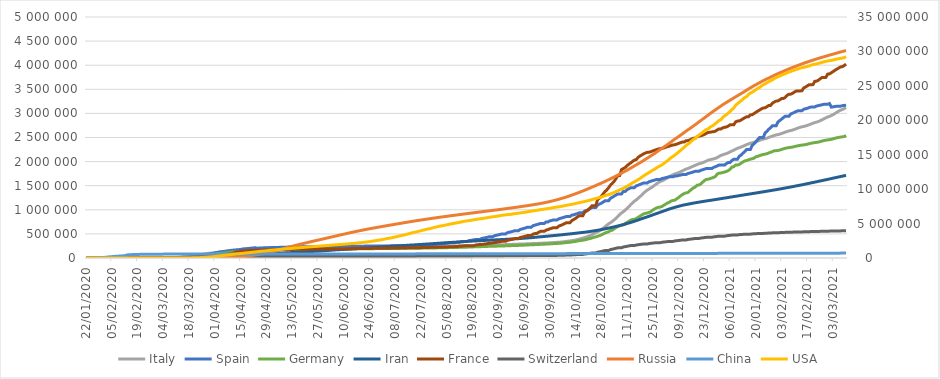
| Category | Italy | Spain | Germany | Iran | France | Switzerland | Russia | China |
|---|---|---|---|---|---|---|---|---|
| 2021-03-10 | 3123368 | 3172101 | 2541781 | 1715162 | 4022429 | 567903 | 4302726 | 101194 |
| 2021-03-09 | 3101093 | 3164982 | 2520618 | 1706559 | 3992755 | 566412 | 4293750 | 101175 |
| 2021-03-08 | 3081368 | 3160970 | 2513784 | 1698005 | 3969612 | 565034 | 4284408 | 101149 |
| 2021-03-07 | 3067486 | 3149012 | 2508655 | 1689692 | 3964078 | 562290 | 4274263 | 101132 |
| 2021-03-06 | 3046762 | 3149012 | 2502151 | 1681682 | 3942243 | 562290 | 4263785 | 101097 |
| 2021-03-05 | 3023129 | 3149012 | 2493887 | 1673470 | 3918937 | 562290 | 4252876 | 101074 |
| 2021-03-04 | 2999119 | 3142358 | 2484306 | 1665103 | 3895430 | 561068 | 4241970 | 101055 |
| 2021-03-03 | 2976274 | 3136321 | 2472913 | 1656699 | 3870144 | 559845 | 4230707 | 101037 |
| 2021-03-02 | 2955434 | 3130184 | 2462061 | 1648174 | 3843241 | 558622 | 4220291 | 101013 |
| 2021-03-01 | 2938371 | 3204531 | 2455569 | 1639679 | 3820369 | 557492 | 4209850 | 100990 |
| 2021-02-28 | 2925265 | 3188553 | 2450295 | 1631169 | 3815639 | 554932 | 4198400 | 100965 |
| 2021-02-27 | 2907825 | 3188553 | 2444177 | 1623159 | 3747263 | 554932 | 4187166 | 100924 |
| 2021-02-26 | 2888923 | 3188553 | 2436506 | 1615184 | 3746707 | 554932 | 4175757 | 100885 |
| 2021-02-25 | 2868435 | 3180212 | 2427069 | 1607081 | 3746475 | 553867 | 4164802 | 100851 |
| 2021-02-24 | 2848564 | 3170644 | 2416037 | 1598875 | 3721061 | 552698 | 4153735 | 100832 |
| 2021-02-23 | 2832162 | 3161432 | 2405263 | 1590605 | 3689534 | 551355 | 4142126 | 100807 |
| 2021-02-22 | 2818863 | 3153971 | 2399499 | 1582275 | 3669354 | 550224 | 4130447 | 100784 |
| 2021-02-21 | 2809246 | 3133122 | 2394515 | 1574012 | 3664700 | 547775 | 4117992 | 100758 |
| 2021-02-20 | 2795796 | 3133122 | 2388421 | 1566081 | 3597113 | 547775 | 4105424 | 100727 |
| 2021-02-19 | 2780882 | 3133122 | 2381259 | 1558159 | 3596167 | 547775 | 4092649 | 100705 |
| 2021-02-18 | 2765412 | 3121687 | 2372209 | 1550142 | 3596156 | 546754 | 4079407 | 100684 |
| 2021-02-17 | 2751657 | 3107172 | 2362364 | 1542076 | 3573638 | 545535 | 4066164 | 100666 |
| 2021-02-16 | 2739591 | 3096343 | 2352766 | 1534034 | 3548452 | 544282 | 4053535 | 100639 |
| 2021-02-15 | 2729223 | 3086286 | 2346876 | 1526023 | 3528856 | 543207 | 4040505 | 100624 |
| 2021-02-14 | 2721879 | 3056035 | 2341744 | 1518263 | 3467884 | 540727 | 4026506 | 100599 |
| 2021-02-13 | 2710819 | 3056035 | 2336906 | 1510873 | 3467051 | 540727 | 4012538 | 100578 |
| 2021-02-12 | 2697296 | 3056035 | 2330414 | 1503753 | 3466623 | 540727 | 3997898 | 100551 |
| 2021-02-11 | 2683403 | 3041454 | 2321225 | 1496455 | 3465964 | 539474 | 3983031 | 100527 |
| 2021-02-10 | 2668266 | 3023601 | 2311297 | 1488981 | 3444888 | 538118 | 3968228 | 100494 |
| 2021-02-09 | 2655319 | 3005487 | 2302051 | 1481396 | 3419210 | 536516 | 3953970 | 100475 |
| 2021-02-08 | 2644707 | 2989085 | 2296323 | 1473756 | 3400324 | 535153 | 3939162 | 100435 |
| 2021-02-07 | 2636738 | 2941990 | 2291673 | 1466435 | 3395981 | 531873 | 3923461 | 100389 |
| 2021-02-06 | 2625098 | 2941990 | 2285003 | 1459370 | 3376266 | 531873 | 3907653 | 100348 |
| 2021-02-05 | 2611659 | 2941990 | 2276027 | 1452380 | 3333773 | 531873 | 3891274 | 100305 |
| 2021-02-04 | 2597446 | 2913425 | 2265536 | 1445326 | 3310071 | 530289 | 3874830 | 100268 |
| 2021-02-03 | 2583790 | 2883465 | 2252504 | 1438286 | 3310051 | 528524 | 3858367 | 100226 |
| 2021-02-02 | 2570608 | 2851869 | 2240017 | 1431416 | 3283645 | 526728 | 3842145 | 100177 |
| 2021-02-01 | 2560957 | 2822805 | 2232327 | 1424596 | 3260308 | 525095 | 3825739 | 100127 |
| 2021-01-31 | 2553032 | 2743119 | 2225659 | 1417999 | 3255920 | 521320 | 3808348 | 100063 |
| 2021-01-30 | 2541783 | 2743119 | 2224911 | 1411731 | 3236685 | 521320 | 3790265 | 99968 |
| 2021-01-29 | 2529070 | 2743119 | 2207278 | 1405414 | 3212613 | 521320 | 3771514 | 99797 |
| 2021-01-28 | 2515507 | 2705001 | 2194562 | 1398841 | 3166145 | 519404 | 3752548 | 99746 |
| 2021-01-27 | 2501147 | 2670102 | 2179679 | 1392314 | 3165449 | 517705 | 3733692 | 99655 |
| 2021-01-26 | 2485956 | 2629817 | 2164043 | 1385706 | 3138498 | 515483 | 3716228 | 99541 |
| 2021-01-25 | 2475372 | 2593382 | 2154656 | 1379286 | 3116355 | 513599 | 3698246 | 99402 |
| 2021-01-24 | 2466813 | 2499560 | 2147769 | 1372977 | 3112055 | 509279 | 3679247 | 99247 |
| 2021-01-23 | 2455185 | 2499560 | 2137691 | 1367032 | 3093619 | 509279 | 3658447 | 99047 |
| 2021-01-22 | 2441854 | 2499560 | 2125154 | 1360852 | 3069663 | 509279 | 3637862 | 98786 |
| 2021-01-21 | 2428221 | 2456675 | 2108895 | 1354520 | 3046371 | 507123 | 3616680 | 98544 |
| 2021-01-20 | 2414166 | 2412318 | 2100618 | 1348316 | 3023661 | 504918 | 3595136 | 98544 |
| 2021-01-19 | 2400598 | 2370742 | 2071615 | 1342134 | 2996784 | 502191 | 3574330 | 98323 |
| 2021-01-18 | 2390102 | 2336451 | 2059382 | 1336217 | 2972889 | 499931 | 3552888 | 98164 |
| 2021-01-17 | 2381277 | 2252164 | 2050129 | 1330411 | 2969091 | 495228 | 3530379 | 97939 |
| 2021-01-16 | 2368733 | 2252164 | 2038645 | 1324395 | 2931686 | 495228 | 3507201 | 97775 |
| 2021-01-15 | 2352423 | 2252164 | 2022884 | 1318295 | 2930994 | 495228 | 3483531 | 97448 |
| 2021-01-14 | 2336279 | 2211967 | 2015235 | 1311810 | 2909723 | 492832 | 3459237 | 97448 |
| 2021-01-13 | 2319036 | 2176089 | 1993892 | 1305339 | 2888292 | 490358 | 3434934 | 97275 |
| 2021-01-12 | 2303263 | 2137220 | 1968326 | 1299022 | 2864360 | 487357 | 3412390 | 97095 |
| 2021-01-11 | 2289021 | 2111782 | 1941116 | 1292614 | 2844680 | 484506 | 3389733 | 96920 |
| 2021-01-10 | 2276491 | 2050360 | 1929410 | 1286406 | 2840864 | 477983 | 3366715 | 96824 |
| 2021-01-09 | 2257866 | 2050360 | 1928462 | 1280438 | 2824920 | 477983 | 3344175 | 96690 |
| 2021-01-08 | 2237890 | 2050360 | 1893901 | 1274514 | 2763563 | 477983 | 3321163 | 96489 |
| 2021-01-07 | 2220361 | 2024904 | 1886561 | 1268263 | 2763370 | 474764 | 3297833 | 96484 |
| 2021-01-06 | 2201945 | 1982544 | 1841228 | 1261903 | 2763116 | 470789 | 3274615 | 96398 |
| 2021-01-05 | 2181619 | 1982544 | 1814565 | 1255620 | 2737884 | 465981 | 3250713 | 96310 |
| 2021-01-04 | 2166244 | 1958844 | 1796216 | 1249507 | 2717059 | 461961 | 3226758 | 96246 |
| 2021-01-03 | 2155446 | 1928265 | 1783896 | 1243434 | 2712975 | 452296 | 3203743 | 96160 |
| 2021-01-02 | 2141201 | 1928265 | 1773540 | 1237474 | 2700480 | 452296 | 3179898 | 96086 |
| 2021-01-01 | 2129376 | 1928265 | 1762244 | 1231429 | 2677871 | 452296 | 3153960 | 96005 |
| 2020-12-31 | 2107166 | 1928265 | 1760520 | 1225142 | 2677666 | 452296 | 3127347 | 95963 |
| 2020-12-30 | 2083689 | 1910218 | 1741153 | 1218753 | 2657624 | 447905 | 3100018 | 95876 |
| 2020-12-29 | 2067487 | 1893502 | 1692109 | 1212481 | 2631110 | 442481 | 3073923 | 95797 |
| 2020-12-28 | 2056277 | 1879413 | 1672643 | 1206373 | 2619616 | 438284 | 3047335 | 95720 |
| 2020-12-27 | 2047696 | 1854951 | 1658639 | 1200465 | 2616510 | 428197 | 3019972 | 95632 |
| 2020-12-26 | 2038759 | 1854951 | 1646240 | 1194963 | 2607688 | 428197 | 2992123 | 95541 |
| 2020-12-25 | 2028354 | 1854951 | 1632512 | 1189203 | 2604595 | 428197 | 2963290 | 95440 |
| 2020-12-24 | 2009317 | 1854951 | 1630596 | 1183182 | 2584333 | 428197 | 2934695 | 95383 |
| 2020-12-23 | 1991278 | 1842289 | 1604129 | 1177004 | 2562615 | 423299 | 2905196 | 95298 |
| 2020-12-22 | 1977370 | 1829903 | 1570371 | 1170743 | 2547577 | 418266 | 2878382 | 95228 |
| 2020-12-21 | 1964054 | 1819249 | 1534218 | 1164535 | 2535716 | 413991 | 2850042 | 95150 |
| 2020-12-20 | 1953185 | 1797236 | 1514962 | 1158384 | 2529756 | 403989 | 2821125 | 95050 |
| 2020-12-19 | 1938083 | 1797236 | 1508518 | 1152072 | 2516957 | 403989 | 2792615 | 94953 |
| 2020-12-18 | 1923158 | 1797236 | 1469667 | 1145651 | 2483661 | 403989 | 2764843 | 94804 |
| 2020-12-17 | 1906377 | 1785421 | 1454009 | 1138530 | 2483524 | 399511 | 2736727 | 94734 |
| 2020-12-16 | 1888144 | 1773290 | 1423830 | 1131077 | 2465126 | 394453 | 2708940 | 94626 |
| 2020-12-15 | 1870576 | 1762212 | 1391086 | 1123474 | 2447406 | 388828 | 2682866 | 94537 |
| 2020-12-14 | 1855737 | 1751884 | 1357261 | 1115770 | 2435751 | 384557 | 2656601 | 94427 |
| 2020-12-13 | 1843712 | 1730575 | 1350810 | 1108269 | 2430612 | 373831 | 2629699 | 94328 |
| 2020-12-12 | 1825775 | 1730575 | 1336101 | 1100818 | 2405255 | 373831 | 2602048 | 94217 |
| 2020-12-11 | 1805873 | 1730575 | 1314309 | 1092407 | 2405210 | 373831 | 2574319 | 94124 |
| 2020-12-10 | 1787147 | 1720056 | 1287092 | 1083023 | 2391643 | 368695 | 2546113 | 94025 |
| 2020-12-09 | 1770149 | 1712101 | 1254358 | 1072620 | 2377913 | 363654 | 2518551 | 93898 |
| 2020-12-08 | 1757394 | 1702328 | 1229269 | 1062397 | 2363196 | 358568 | 2492713 | 93782 |
| 2020-12-07 | 1742557 | 1702328 | 1200006 | 1051374 | 2349059 | 354306 | 2466961 | 93670 |
| 2020-12-06 | 1728878 | 1684647 | 1194550 | 1040547 | 2345648 | 344497 | 2439163 | 93577 |
| 2020-12-05 | 1709991 | 1684647 | 1183640 | 1028986 | 2334626 | 344497 | 2410462 | 93467 |
| 2020-12-04 | 1688939 | 1684647 | 1157514 | 1016835 | 2321703 | 344497 | 2382012 | 93348 |
| 2020-12-03 | 1664829 | 1675902 | 1141544 | 1003494 | 2310271 | 340115 | 2354934 | 93221 |
| 2020-12-02 | 1641610 | 1665775 | 1117953 | 989572 | 2297393 | 335660 | 2327105 | 93113 |
| 2020-12-01 | 1620901 | 1656444 | 1094678 | 975951 | 2283172 | 330874 | 2302062 | 92993 |
| 2020-11-30 | 1601554 | 1648187 | 1069912 | 962070 | 2274902 | 327072 | 2275936 | 92902 |
| 2020-11-29 | 1585178 | 1628208 | 1055691 | 948749 | 2270573 | 318290 | 2249890 | 92814 |
| 2020-11-28 | 1564532 | 1628208 | 1052494 | 935799 | 2260789 | 318290 | 2223500 | 92681 |
| 2020-11-27 | 1538217 | 1628208 | 1038649 | 922397 | 2248209 | 318290 | 2196691 | 92586 |
| 2020-11-26 | 1509875 | 1617355 | 1017830 | 908346 | 2235537 | 313978 | 2169424 | 92488 |
| 2020-11-25 | 1480874 | 1605066 | 995879 | 894385 | 2221874 | 309469 | 2144229 | 92402 |
| 2020-11-24 | 1455022 | 1594844 | 963192 | 880542 | 2206126 | 304593 | 2120836 | 92296 |
| 2020-11-23 | 1431795 | 1582616 | 946822 | 866821 | 2195940 | 300352 | 2096749 | 92211 |
| 2020-11-22 | 1408868 | 1556730 | 932367 | 854361 | 2191180 | 290601 | 2071858 | 92116 |
| 2020-11-21 | 1380531 | 1556730 | 927990 | 841308 | 2178023 | 290601 | 2047563 | 92037 |
| 2020-11-20 | 1345767 | 1556730 | 914118 | 828377 | 2160343 | 290601 | 2023025 | 91977 |
| 2020-11-19 | 1308528 | 1541574 | 891525 | 815117 | 2137096 | 285655 | 1998966 | 91935 |
| 2020-11-18 | 1272352 | 1525341 | 867484 | 801894 | 2115717 | 280648 | 1975629 | 91906 |
| 2020-11-17 | 1238072 | 1510023 | 843757 | 788473 | 2087183 | 274534 | 1954912 | 91885 |
| 2020-11-16 | 1205881 | 1496864 | 817526 | 775121 | 2041293 | 269974 | 1932711 | 91872 |
| 2020-11-15 | 1178529 | 1458591 | 802946 | 762068 | 2031472 | 257135 | 1910149 | 91850 |
| 2020-11-14 | 1144552 | 1458591 | 799733 | 749525 | 2004244 | 257135 | 1887836 | 91828 |
| 2020-11-13 | 1107303 | 1458591 | 785093 | 738322 | 1972149 | 257135 | 1865395 | 91807 |
| 2020-11-12 | 1066401 | 1437220 | 762832 | 726585 | 1948134 | 250396 | 1843678 | 91783 |
| 2020-11-11 | 1028424 | 1417709 | 738094 | 715068 | 1914722 | 243472 | 1822345 | 91752 |
| 2020-11-10 | 995463 | 1381218 | 715693 | 703288 | 1878498 | 235202 | 1802762 | 91719 |
| 2020-11-09 | 960373 | 1381218 | 689146 | 692949 | 1856027 | 229222 | 1781997 | 91693 |
| 2020-11-08 | 935104 | 1328832 | 682624 | 682486 | 1835187 | 211913 | 1760420 | 91665 |
| 2020-11-07 | 902490 | 1328832 | 668114 | 673250 | 1709773 | 211913 | 1740172 | 91622 |
| 2020-11-06 | 862681 | 1328832 | 653992 | 663800 | 1709716 | 211913 | 1720063 | 91591 |
| 2020-11-05 | 824879 | 1306316 | 631172 | 654936 | 1648989 | 202504 | 1699695 | 91552 |
| 2020-11-04 | 790377 | 1284408 | 608611 | 646164 | 1591152 | 192376 | 1680579 | 91509 |
| 2020-11-03 | 759829 | 1259366 | 577131 | 637712 | 1549174 | 182303 | 1661096 | 91478 |
| 2020-11-02 | 731588 | 1240697 | 569598 | 628780 | 1512541 | 176177 | 1642665 | 91452 |
| 2020-11-01 | 709335 | 1185678 | 544346 | 620491 | 1458999 | 154251 | 1624648 | 91397 |
| 2020-10-31 | 679430 | 1185678 | 531790 | 612772 | 1412709 | 154251 | 1606267 | 91366 |
| 2020-10-30 | 647674 | 1185678 | 517736 | 604952 | 1377347 | 154251 | 1588433 | 91339 |
| 2020-10-29 | 616595 | 1160083 | 498354 | 596941 | 1327852 | 145044 | 1570446 | 91299 |
| 2020-10-28 | 589766 | 1136503 | 479621 | 588648 | 1280215 | 135658 | 1553028 | 91271 |
| 2020-10-27 | 564778 | 1116738 | 463419 | 581824 | 1244242 | 127042 | 1537142 | 91222 |
| 2020-10-26 | 542789 | 1098320 | 450258 | 574856 | 1209651 | 121093 | 1520800 | 91175 |
| 2020-10-25 | 525782 | 1046132 | 437698 | 568896 | 1084746 | 103653 | 1503652 | 91151 |
| 2020-10-24 | 504509 | 1046132 | 427808 | 562705 | 1084684 | 103653 | 1487260 | 91128 |
| 2020-10-23 | 484869 | 1046132 | 417350 | 556891 | 1084659 | 103653 | 1471000 | 91108 |
| 2020-10-22 | 465726 | 1026281 | 403874 | 550757 | 1041991 | 97019 | 1453923 | 91073 |
| 2020-10-21 | 449648 | 1005295 | 397922 | 545286 | 1000369 | 91763 | 1438219 | 91044 |
| 2020-10-20 | 434449 | 988322 | 385591 | 539670 | 973275 | 86167 | 1422775 | 91022 |
| 2020-10-19 | 423578 | 974449 | 377068 | 534631 | 952600 | 83159 | 1406667 | 91006 |
| 2020-10-18 | 414241 | 936560 | 368671 | 530380 | 876342 | 74422 | 1390824 | 90972 |
| 2020-10-17 | 402536 | 936560 | 364664 | 526490 | 876342 | 74422 | 1376020 | 90955 |
| 2020-10-16 | 391611 | 936560 | 359802 | 522387 | 876342 | 74422 | 1361317 | 90925 |
| 2020-10-15 | 381602 | 921374 | 352107 | 517835 | 850997 | 71317 | 1346380 | 90905 |
| 2020-10-14 | 372799 | 908056 | 344487 | 513219 | 820376 | 68704 | 1332824 | 90869 |
| 2020-10-13 | 365467 | 896086 | 337314 | 508389 | 798257 | 65881 | 1318783 | 90858 |
| 2020-10-12 | 359569 | 888968 | 332850 | 504281 | 776097 | 64436 | 1305093 | 90830 |
| 2020-10-11 | 354950 | 861112 | 326309 | 500075 | 732434 | 60368 | 1291687 | 90812 |
| 2020-10-10 | 349494 | 861112 | 323463 | 496253 | 732434 | 60368 | 1278245 | 90778 |
| 2020-10-09 | 343770 | 861112 | 320495 | 492378 | 732434 | 60368 | 1265572 | 90751 |
| 2020-10-08 | 338398 | 848324 | 315941 | 488236 | 711704 | 58881 | 1253603 | 90728 |
| 2020-10-07 | 333940 | 835901 | 311137 | 483844 | 693603 | 57709 | 1242258 | 90687 |
| 2020-10-06 | 330263 | 825410 | 307127 | 479825 | 675736 | 56632 | 1231277 | 90667 |
| 2020-10-05 | 327586 | 813412 | 304673 | 475674 | 664289 | 55932 | 1219796 | 90652 |
| 2020-10-04 | 325329 | 789932 | 301573 | 471772 | 629509 | 54384 | 1209039 | 90629 |
| 2020-10-03 | 322751 | 789932 | 300027 | 468119 | 629509 | 54384 | 1198663 | 90604 |
| 2020-10-02 | 319908 | 789932 | 298374 | 464596 | 629431 | 54384 | 1188928 | 90584 |
| 2020-10-01 | 317409 | 778607 | 295539 | 461044 | 616986 | 53832 | 1179634 | 90567 |
| 2020-09-30 | 314861 | 769188 | 292913 | 457219 | 604031 | 53282 | 1170799 | 90545 |
| 2020-09-29 | 313011 | 748266 | 290471 | 453637 | 590021 | 52871 | 1162428 | 90528 |
| 2020-09-28 | 311364 | 748266 | 288631 | 449960 | 577980 | 52646 | 1154299 | 90505 |
| 2020-09-27 | 309870 | 716481 | 286339 | 446448 | 552473 | 51864 | 1146273 | 90483 |
| 2020-09-26 | 308104 | 716481 | 285026 | 443086 | 552454 | 51864 | 1138509 | 90456 |
| 2020-09-25 | 306235 | 716481 | 283712 | 439882 | 552421 | 51864 | 1131088 | 90441 |
| 2020-09-24 | 304323 | 704209 | 281346 | 436319 | 536289 | 51492 | 1123976 | 90424 |
| 2020-09-23 | 302537 | 693556 | 279025 | 432798 | 508456 | 51101 | 1117487 | 90409 |
| 2020-09-22 | 300897 | 682267 | 277412 | 429193 | 507150 | 50664 | 1111157 | 90399 |
| 2020-09-21 | 299506 | 671468 | 275560 | 425481 | 496851 | 50378 | 1105048 | 90381 |
| 2020-09-20 | 298156 | 640040 | 273965 | 422140 | 467614 | 49283 | 1098958 | 90369 |
| 2020-09-19 | 296569 | 640040 | 272932 | 419043 | 467614 | 49283 | 1092915 | 90334 |
| 2020-09-18 | 294932 | 640040 | 271247 | 416198 | 467421 | 49283 | 1086955 | 90311 |
| 2020-09-17 | 293025 | 625651 | 269048 | 413149 | 454266 | 48795 | 1081152 | 90294 |
| 2020-09-16 | 291442 | 614360 | 266869 | 410334 | 443869 | 48265 | 1075485 | 90253 |
| 2020-09-15 | 289990 | 603167 | 265014 | 407353 | 433905 | 47751 | 1069873 | 90235 |
| 2020-09-14 | 288761 | 593730 | 263222 | 404648 | 425870 | 47436 | 1064438 | 90219 |
| 2020-09-13 | 287753 | 566326 | 261737 | 402029 | 402893 | 47179 | 1059024 | 90197 |
| 2020-09-12 | 286297 | 566326 | 260817 | 399940 | 402811 | 46704 | 1053663 | 90168 |
| 2020-09-11 | 284796 | 566326 | 259735 | 397801 | 401890 | 46239 | 1048257 | 90145 |
| 2020-09-10 | 283180 | 554143 | 258149 | 395488 | 392243 | 45711 | 1042836 | 90127 |
| 2020-09-09 | 281583 | 543379 | 256433 | 393425 | 383292 | 45306 | 1037526 | 90100 |
| 2020-09-08 | 280153 | 534513 | 254957 | 391112 | 373718 | 44837 | 1032354 | 90087 |
| 2020-09-07 | 278784 | 525549 | 253626 | 388810 | 367174 | 44592 | 1027334 | 90078 |
| 2020-09-06 | 277634 | 498989 | 251728 | 386658 | 347268 | 44401 | 1022228 | 90058 |
| 2020-09-05 | 276338 | 498989 | 251058 | 384666 | 347267 | 43957 | 1017131 | 90025 |
| 2020-09-04 | 274644 | 498989 | 250283 | 382772 | 347267 | 43532 | 1011987 | 90008 |
| 2020-09-03 | 272912 | 488513 | 248840 | 380746 | 338220 | 43127 | 1006923 | 89986 |
| 2020-09-02 | 271515 | 479554 | 247411 | 378752 | 331060 | 42763 | 1001965 | 89953 |
| 2020-09-01 | 270189 | 470973 | 246015 | 376894 | 323968 | 42393 | 997072 | 89933 |
| 2020-08-31 | 269214 | 462858 | 244802 | 375212 | 318986 | 42177 | 992402 | 89914 |
| 2020-08-30 | 268218 | 439286 | 243305 | 373570 | 315813 | 42014 | 987470 | 89895 |
| 2020-08-29 | 266853 | 439286 | 242835 | 371816 | 304947 | 41722 | 982573 | 89863 |
| 2020-08-28 | 265409 | 439286 | 242126 | 369911 | 304947 | 41346 | 977730 | 89836 |
| 2020-08-27 | 263949 | 429507 | 240571 | 367796 | 297485 | 41006 | 972972 | 89814 |
| 2020-08-26 | 262540 | 419849 | 239010 | 365606 | 291374 | 40645 | 968297 | 89784 |
| 2020-08-25 | 261174 | 412553 | 237583 | 363363 | 285902 | 40262 | 963655 | 89752 |
| 2020-08-24 | 260298 | 405436 | 236122 | 361150 | 282414 | 40060 | 959016 | 89718 |
| 2020-08-23 | 259345 | 386054 | 234494 | 358905 | 280459 | 39903 | 954328 | 89695 |
| 2020-08-22 | 258136 | 386054 | 233861 | 356792 | 275562 | 39627 | 949531 | 89654 |
| 2020-08-21 | 257065 | 386054 | 233029 | 354764 | 271960 | 39332 | 944671 | 89616 |
| 2020-08-20 | 256118 | 377906 | 231292 | 352558 | 256534 | 39026 | 939833 | 89567 |
| 2020-08-19 | 255278 | 370867 | 229706 | 350279 | 256534 | 38760 | 935066 | 89527 |
| 2020-08-18 | 254636 | 364196 | 228120 | 347835 | 256534 | 38449 | 930276 | 89494 |
| 2020-08-17 | 254235 | 359082 | 226700 | 345450 | 256533 | 38252 | 925558 | 89441 |
| 2020-08-16 | 253915 | 342813 | 225007 | 343203 | 252965 | 38124 | 920719 | 89375 |
| 2020-08-15 | 253438 | 342813 | 224488 | 341070 | 252965 | 37924 | 915808 | 89279 |
| 2020-08-14 | 252809 | 342813 | 223791 | 338825 | 249655 | 37671 | 910778 | 89214 |
| 2020-08-13 | 252235 | 337334 | 222281 | 336324 | 244096 | 37403 | 905762 | 89144 |
| 2020-08-12 | 251713 | 329784 | 220859 | 333699 | 244088 | 37169 | 900745 | 89045 |
| 2020-08-11 | 251237 | 326612 | 219540 | 331189 | 239355 | 36895 | 895691 | 88958 |
| 2020-08-10 | 250825 | 322980 | 218508 | 328844 | 239349 | 36708 | 890799 | 88906 |
| 2020-08-09 | 250566 | 314362 | 217288 | 326712 | 235237 | 36603 | 885718 | 88793 |
| 2020-08-08 | 250103 | 314362 | 216903 | 324692 | 235208 | 36451 | 880563 | 88672 |
| 2020-08-07 | 249756 | 314362 | 216196 | 322567 | 235207 | 36269 | 875378 | 88580 |
| 2020-08-06 | 249204 | 309855 | 215039 | 320117 | 231310 | 36108 | 870187 | 88460 |
| 2020-08-05 | 248803 | 305767 | 214113 | 317483 | 228576 | 35927 | 864948 | 88328 |
| 2020-08-04 | 248419 | 302814 | 212828 | 314786 | 228576 | 35746 | 859762 | 88206 |
| 2020-08-03 | 248229 | 297054 | 212111 | 312035 | 225198 | 35616 | 854641 | 88099 |
| 2020-08-02 | 248070 | 288522 | 211220 | 309437 | 225198 | 35550 | 849277 | 87985 |
| 2020-08-01 | 247832 | 288522 | 211005 | 306752 | 225198 | 35412 | 843890 | 87827 |
| 2020-07-31 | 247537 | 288522 | 210399 | 304204 | 225197 | 35232 | 838461 | 87655 |
| 2020-07-30 | 247158 | 285430 | 209535 | 301530 | 222469 | 35022 | 832993 | 87489 |
| 2020-07-29 | 246776 | 282641 | 208546 | 298909 | 221077 | 34802 | 827509 | 87213 |
| 2020-07-28 | 246488 | 280610 | 207707 | 296273 | 221077 | 34609 | 822060 | 86990 |
| 2020-07-27 | 246286 | 278782 | 207112 | 293606 | 220352 | 34477 | 816680 | 86783 |
| 2020-07-26 | 246118 | 272421 | 206667 | 291172 | 217801 | 34412 | 811073 | 86570 |
| 2020-07-25 | 245864 | 272421 | 206278 | 288839 | 217801 | 34302 | 805332 | 86381 |
| 2020-07-24 | 245590 | 272421 | 205623 | 286523 | 217797 | 34154 | 799499 | 86202 |
| 2020-07-23 | 245338 | 270166 | 204881 | 284034 | 216667 | 34000 | 793720 | 86045 |
| 2020-07-22 | 245032 | 267551 | 204276 | 281413 | 215605 | 33883 | 787890 | 85906 |
| 2020-07-21 | 244752 | 266194 | 203717 | 278827 | 214607 | 33742 | 782040 | 85708 |
| 2020-07-20 | 244624 | 264836 | 203325 | 276202 | 214023 | 33634 | 776212 | 85622 |
| 2020-07-19 | 244434 | 260255 | 202735 | 273788 | 211943 | 33591 | 770311 | 85503 |
| 2020-07-18 | 244216 | 260255 | 202426 | 271606 | 211943 | 33492 | 764215 | 85418 |
| 2020-07-17 | 243967 | 260255 | 202045 | 269440 | 211943 | 33382 | 758001 | 85402 |
| 2020-07-16 | 243736 | 258855 | 201450 | 267061 | 211102 | 33290 | 751612 | 85327 |
| 2020-07-15 | 243506 | 257494 | 200890 | 264561 | 210568 | 33148 | 745197 | 85246 |
| 2020-07-14 | 243344 | 256619 | 200456 | 262173 | 209640 | 33016 | 738787 | 85226 |
| 2020-07-13 | 243230 | 255953 | 200180 | 259652 | 209640 | 32946 | 732547 | 85117 |
| 2020-07-12 | 243061 | 253908 | 199919 | 257303 | 208015 | 32883 | 726036 | 85117 |
| 2020-07-11 | 242827 | 253908 | 199709 | 255117 | 208015 | 32817 | 719449 | 85071 |
| 2020-07-10 | 242639 | 253908 | 199332 | 252720 | 208015 | 32690 | 712863 | 84992 |
| 2020-07-09 | 242363 | 253056 | 199001 | 250458 | 207356 | 32586 | 706240 | 84992 |
| 2020-07-08 | 242149 | 252513 | 198699 | 248379 | 206072 | 32498 | 699749 | 84950 |
| 2020-07-07 | 241956 | 252130 | 198343 | 245688 | 206072 | 32369 | 693215 | 84917 |
| 2020-07-06 | 241819 | 251789 | 198064 | 243051 | 205597 | 32315 | 686852 | 84889 |
| 2020-07-05 | 241611 | 250545 | 197523 | 240438 | 204222 | 32268 | 680283 | 84871 |
| 2020-07-04 | 241419 | 250545 | 197198 | 237878 | 204222 | 32198 | 673564 | 84857 |
| 2020-07-03 | 241184 | 250545 | 196780 | 235429 | 204222 | 32101 | 666941 | 84838 |
| 2020-07-02 | 240961 | 250103 | 196370 | 232863 | 203640 | 31967 | 660231 | 84830 |
| 2020-07-01 | 240760 | 249659 | 195893 | 230211 | 202981 | 31851 | 653479 | 84816 |
| 2020-06-30 | 240578 | 249271 | 195418 | 227662 | 202063 | 31714 | 646929 | 84785 |
| 2020-06-29 | 240436 | 248970 | 195042 | 225205 | 201522 | 31652 | 640246 | 84780 |
| 2020-06-28 | 240310 | 248770 | 194693 | 222669 | 199476 | 31617 | 633563 | 84757 |
| 2020-06-27 | 240136 | 248469 | 194458 | 220180 | 200195 | 31555 | 626779 | 84743 |
| 2020-06-26 | 239961 | 247905 | 194036 | 217724 | 200195 | 31486 | 619936 | 84725 |
| 2020-06-25 | 239706 | 247486 | 193371 | 215096 | 198607 | 31428 | 613148 | 84701 |
| 2020-06-24 | 239410 | 247086 | 192871 | 212501 | 198607 | 31376 | 606043 | 84673 |
| 2020-06-23 | 238833 | 246752 | 192480 | 209970 | 198526 | 31332 | 598878 | 84653 |
| 2020-06-22 | 238720 | 246504 | 191768 | 207525 | 198009 | 31310 | 591465 | 84624 |
| 2020-06-21 | 238499 | 246272 | 191272 | 204952 | 197636 | 31292 | 583879 | 84572 |
| 2020-06-20 | 238275 | 245938 | 190670 | 202584 | 197352 | 31243 | 576162 | 84553 |
| 2020-06-19 | 238011 | 245575 | 190299 | 200262 | 196711 | 31235 | 568292 | 84494 |
| 2020-06-18 | 238159 | 245268 | 189817 | 197647 | 195900 | 31200 | 560321 | 84494 |
| 2020-06-17 | 237828 | 244683 | 188604 | 195051 | 195433 | 31187 | 552549 | 84458 |
| 2020-06-16 | 237500 | 244328 | 188252 | 192439 | 194975 | 31154 | 544725 | 84422 |
| 2020-06-15 | 237290 | 244109 | 187682 | 189876 | 194631 | 31131 | 536484 | 84378 |
| 2020-06-14 | 236989 | 243928 | 187518 | 187427 | 194479 | 31117 | 528267 | 84335 |
| 2020-06-13 | 236651 | 243605 | 187267 | 184955 | 194072 | 31094 | 519458 | 84286 |
| 2020-06-12 | 236305 | 243209 | 187226 | 182525 | 193546 | 31063 | 510761 | 84228 |
| 2020-06-11 | 236142 | 242707 | 186691 | 180156 | 192819 | 31044 | 501800 | 84216 |
| 2020-06-10 | 235763 | 242280 | 186522 | 177938 | 192394 | 31011 | 493023 | 84209 |
| 2020-06-09 | 235561 | 241966 | 186506 | 175927 | 191849 | 30988 | 484630 | 84198 |
| 2020-06-08 | 235278 | 241717 | 186109 | 173832 | 191445 | 30972 | 476043 | 84195 |
| 2020-06-07 | 234998 | 241550 | 185750 | 171789 | 191234 | 30965 | 467073 | 84191 |
| 2020-06-06 | 234801 | 241310 | 185450 | 169425 | 190891 | 30956 | 458102 | 84186 |
| 2020-06-05 | 234531 | 240978 | 184924 | 167156 | 190312 | 30936 | 449256 | 84177 |
| 2020-06-04 | 234013 | 240660 | 184472 | 164270 | 189701 | 30913 | 440538 | 84171 |
| 2020-06-03 | 233836 | 240326 | 184121 | 160696 | 188934 | 30893 | 431715 | 84160 |
| 2020-06-02 | 233515 | 239932 | 183879 | 157562 | 188582 | 30874 | 423186 | 84161 |
| 2020-06-01 | 233197 | 239638 | 183594 | 154445 | 189348 | 30871 | 414328 | 84154 |
| 2020-05-31 | 232997 | 239479 | 183410 | 151466 | 189009 | 30862 | 405843 | 84146 |
| 2020-05-30 | 232664 | 239228 | 183189 | 148950 | 188752 | 30845 | 396575 | 84128 |
| 2020-05-29 | 232248 | 238564 | 182922 | 146668 | 186923 | 30828 | 387623 | 84123 |
| 2020-05-28 | 231732 | 237906 | 182196 | 143849 | 186364 | 30796 | 379051 | 84106 |
| 2020-05-27 | 231139 | 236259 | 181524 | 141591 | 183038 | 30776 | 370680 | 84106 |
| 2020-05-26 | 230555 | 236259 | 181200 | 139511 | 182847 | 30761 | 362342 | 84103 |
| 2020-05-25 | 230158 | 235400 | 180600 | 137724 | 183067 | 30746 | 353427 | 84102 |
| 2020-05-24 | 229858 | 235772 | 180328 | 135701 | 182709 | 30736 | 344481 | 84095 |
| 2020-05-23 | 229327 | 235290 | 179986 | 133521 | 182694 | 30725 | 335882 | 84084 |
| 2020-05-22 | 228658 | 234824 | 179710 | 131652 | 182354 | 30707 | 326448 | 84081 |
| 2020-05-21 | 228006 | 233037 | 179021 | 129341 | 181951 | 30694 | 317554 | 84063 |
| 2020-05-20 | 227364 | 232555 | 178473 | 126949 | 181700 | 30658 | 308705 | 84063 |
| 2020-05-19 | 226699 | 232037 | 177778 | 124603 | 180933 | 30618 | 299941 | 84063 |
| 2020-05-18 | 225886 | 231606 | 176551 | 122492 | 180051 | 30597 | 290678 | 84063 |
| 2020-05-17 | 225435 | 230698 | 176369 | 120198 | 179693 | 30587 | 281752 | 84054 |
| 2020-05-16 | 224760 | 230698 | 175752 | 118392 | 179630 | 30572 | 272043 | 84044 |
| 2020-05-15 | 223885 | 230183 | 175233 | 116635 | 179630 | 30514 | 262843 | 84038 |
| 2020-05-14 | 223096 | 229540 | 174478 | 114533 | 178994 | 30463 | 252245 | 84029 |
| 2020-05-13 | 222104 | 228691 | 174098 | 112725 | 178184 | 30413 | 242271 | 84024 |
| 2020-05-12 | 221216 | 228030 | 173171 | 110767 | 178349 | 30380 | 232243 | 84018 |
| 2020-05-11 | 219814 | 227436 | 172576 | 109286 | 177547 | 30344 | 221344 | 84011 |
| 2020-05-10 | 219070 | 224350 | 171879 | 107603 | 177094 | 30305 | 209688 | 84010 |
| 2020-05-09 | 218268 | 223578 | 171324 | 106220 | 176782 | 30251 | 198676 | 83990 |
| 2020-05-08 | 217185 | 222857 | 170588 | 104691 | 176202 | 30207 | 187859 | 83976 |
| 2020-05-07 | 215858 | 221447 | 169430 | 103135 | 174918 | 30126 | 177160 | 83975 |
| 2020-05-06 | 214457 | 220325 | 168162 | 101650 | 174224 | 30060 | 165929 | 83970 |
| 2020-05-05 | 213013 | 219329 | 167007 | 99970 | 170687 | 30009 | 155370 | 83968 |
| 2020-05-04 | 211938 | 218011 | 166152 | 98647 | 169583 | 29981 | 145268 | 83966 |
| 2020-05-03 | 210717 | 217466 | 165664 | 97424 | 168925 | 29905 | 134687 | 83964 |
| 2020-05-02 | 209328 | 216582 | 164967 | 96448 | 168518 | 29817 | 124054 | 83959 |
| 2020-05-01 | 207428 | 215216 | 164077 | 95646 | 167305 | 29705 | 114431 | 83959 |
| 2020-04-30 | 205463 | 213435 | 163009 | 94640 | 167299 | 29586 | 106498 | 83956 |
| 2020-04-29 | 203591 | 212917 | 161539 | 93657 | 166543 | 29407 | 99399 | 83944 |
| 2020-04-28 | 201505 | 210773 | 159912 | 92584 | 169053 | 29264 | 93558 | 83940 |
| 2020-04-27 | 199414 | 209465 | 158758 | 91472 | 165963 | 29164 | 87147 | 83918 |
| 2020-04-26 | 197675 | 207634 | 157770 | 90481 | 162220 | 29061 | 80949 | 83912 |
| 2020-04-25 | 195351 | 205905 | 156513 | 89328 | 161644 | 28894 | 74588 | 83909 |
| 2020-04-24 | 192994 | 202990 | 154999 | 88194 | 159952 | 28677 | 68622 | 83899 |
| 2020-04-23 | 189973 | 213024 | 153129 | 87026 | 158303 | 28496 | 62773 | 83884 |
| 2020-04-22 | 187327 | 208389 | 150648 | 85996 | 155980 | 28268 | 57999 | 83868 |
| 2020-04-21 | 183957 | 204178 | 148291 | 84802 | 158168 | 28063 | 52763 | 83853 |
| 2020-04-20 | 181228 | 200210 | 147065 | 83505 | 155393 | 27944 | 47121 | 83817 |
| 2020-04-19 | 178972 | 198674 | 145184 | 82211 | 153011 | 27740 | 42853 | 83805 |
| 2020-04-18 | 175925 | 191726 | 143342 | 80868 | 148086 | 27404 | 36793 | 83787 |
| 2020-04-17 | 172434 | 190839 | 141397 | 79494 | 148084 | 27078 | 32008 | 83760 |
| 2020-04-16 | 168941 | 184948 | 137698 | 77995 | 146075 | 26732 | 27938 | 83403 |
| 2020-04-15 | 165155 | 177644 | 134753 | 76389 | 133585 | 26336 | 24490 | 83356 |
| 2020-04-14 | 162488 | 172541 | 131359 | 74877 | 130365 | 25936 | 21102 | 83306 |
| 2020-04-13 | 159516 | 170099 | 130072 | 73303 | 125394 | 25688 | 18328 | 83213 |
| 2020-04-12 | 156363 | 166831 | 127854 | 71686 | 121712 | 25415 | 15770 | 83134 |
| 2020-04-11 | 152271 | 163027 | 124908 | 70029 | 94863 | 25107 | 13584 | 83014 |
| 2020-04-10 | 147577 | 158273 | 122171 | 68192 | 91738 | 24551 | 11917 | 82941 |
| 2020-04-09 | 143626 | 153222 | 118181 | 66220 | 87366 | 24051 | 10131 | 82883 |
| 2020-04-08 | 139422 | 148220 | 113296 | 64586 | 83057 | 23280 | 8672 | 82809 |
| 2020-04-07 | 135586 | 141942 | 107663 | 62589 | 79163 | 22253 | 7497 | 82718 |
| 2020-04-06 | 132547 | 136675 | 103374 | 60500 | 75343 | 21657 | 6343 | 82665 |
| 2020-04-05 | 128948 | 131646 | 100123 | 58226 | 71412 | 21100 | 5389 | 82602 |
| 2020-04-04 | 124632 | 126168 | 96092 | 55743 | 69500 | 20505 | 4731 | 82543 |
| 2020-04-03 | 119827 | 119199 | 91159 | 53183 | 65202 | 19606 | 4149 | 82511 |
| 2020-04-02 | 115242 | 112065 | 84794 | 50468 | 59929 | 18827 | 3548 | 82432 |
| 2020-04-01 | 110574 | 104118 | 77872 | 47593 | 57749 | 17768 | 2777 | 82361 |
| 2020-03-31 | 105792 | 95923 | 71808 | 44605 | 52827 | 16605 | 2337 | 82279 |
| 2020-03-30 | 101739 | 87956 | 66885 | 41495 | 45170 | 15922 | 1836 | 82198 |
| 2020-03-29 | 97689 | 80110 | 62095 | 38309 | 40708 | 14829 | 1534 | 82122 |
| 2020-03-28 | 92472 | 73235 | 57695 | 35408 | 38105 | 14076 | 1264 | 81999 |
| 2020-03-27 | 86498 | 65719 | 50871 | 32332 | 33402 | 12928 | 1036 | 81897 |
| 2020-03-26 | 80589 | 57786 | 43938 | 29406 | 29551 | 11811 | 840 | 81782 |
| 2020-03-25 | 74386 | 49515 | 37323 | 27017 | 25600 | 10897 | 658 | 81661 |
| 2020-03-24 | 69176 | 39885 | 32986 | 24811 | 22622 | 9877 | 495 | 81591 |
| 2020-03-23 | 63927 | 35136 | 29056 | 23049 | 20123 | 8795 | 438 | 81498 |
| 2020-03-22 | 59138 | 28768 | 24873 | 21638 | 16243 | 7474 | 367 | 81435 |
| 2020-03-21 | 53578 | 25374 | 22213 | 20610 | 14463 | 6575 | 306 | 81305 |
| 2020-03-20 | 47021 | 20410 | 19848 | 19644 | 12726 | 5294 | 253 | 81250 |
| 2020-03-19 | 41035 | 17963 | 15320 | 18407 | 10947 | 4075 | 199 | 81156 |
| 2020-03-18 | 35713 | 13910 | 12327 | 17361 | 9105 | 3028 | 147 | 81102 |
| 2020-03-17 | 31506 | 11748 | 9257 | 16169 | 7699 | 2700 | 114 | 81058 |
| 2020-03-16 | 27980 | 9942 | 7272 | 14991 | 6668 | 2200 | 90 | 81033 |
| 2020-03-15 | 24747 | 7798 | 5795 | 13938 | 4523 | 2200 | 63 | 81003 |
| 2020-03-14 | 21157 | 6391 | 4585 | 12729 | 4487 | 1359 | 59 | 80977 |
| 2020-03-13 | 17660 | 5232 | 3675 | 11364 | 3678 | 1139 | 45 | 80945 |
| 2020-03-12 | 12462 | 2277 | 2078 | 10075 | 2290 | 652 | 28 | 80932 |
| 2020-03-11 | 12462 | 2277 | 1908 | 9000 | 2290 | 652 | 20 | 80921 |
| 2020-03-10 | 10149 | 1695 | 1457 | 8042 | 1792 | 491 | 20 | 80887 |
| 2020-03-09 | 9172 | 1073 | 1176 | 7161 | 1217 | 374 | 17 | 80860 |
| 2020-03-08 | 7375 | 673 | 1040 | 6566 | 1134 | 337 | 17 | 80823 |
| 2020-03-07 | 5883 | 500 | 799 | 5823 | 957 | 268 | 13 | 80770 |
| 2020-03-06 | 4636 | 400 | 670 | 4747 | 656 | 214 | 13 | 80690 |
| 2020-03-05 | 3858 | 259 | 482 | 3513 | 380 | 114 | 4 | 80537 |
| 2020-03-04 | 3089 | 222 | 262 | 2922 | 288 | 90 | 3 | 80386 |
| 2020-03-03 | 2502 | 165 | 196 | 2336 | 204 | 56 | 3 | 80261 |
| 2020-03-02 | 2036 | 120 | 159 | 1501 | 191 | 42 | 3 | 80136 |
| 2020-03-01 | 1694 | 84 | 130 | 978 | 130 | 27 | 2 | 79932 |
| 2020-02-29 | 1128 | 45 | 79 | 593 | 100 | 18 | 2 | 79356 |
| 2020-02-28 | 888 | 32 | 48 | 388 | 57 | 8 | 2 | 78928 |
| 2020-02-27 | 655 | 15 | 46 | 245 | 38 | 8 | 2 | 78600 |
| 2020-02-26 | 453 | 13 | 27 | 139 | 18 | 1 | 2 | 78166 |
| 2020-02-25 | 322 | 6 | 17 | 95 | 14 | 1 | 2 | 77754 |
| 2020-02-24 | 229 | 2 | 16 | 61 | 12 | 0 | 2 | 77241 |
| 2020-02-23 | 155 | 2 | 16 | 43 | 12 | 0 | 2 | 77022 |
| 2020-02-22 | 62 | 2 | 16 | 28 | 12 | 0 | 2 | 77001 |
| 2020-02-21 | 20 | 2 | 16 | 18 | 12 | 0 | 2 | 75550 |
| 2020-02-20 | 3 | 2 | 16 | 5 | 12 | 0 | 2 | 75077 |
| 2020-02-19 | 3 | 2 | 16 | 2 | 12 | 0 | 2 | 74619 |
| 2020-02-18 | 3 | 2 | 16 | 0 | 12 | 0 | 2 | 74211 |
| 2020-02-17 | 3 | 2 | 16 | 0 | 12 | 0 | 2 | 72434 |
| 2020-02-16 | 3 | 2 | 16 | 0 | 12 | 0 | 2 | 70513 |
| 2020-02-15 | 3 | 2 | 16 | 0 | 12 | 0 | 2 | 68413 |
| 2020-02-14 | 3 | 2 | 16 | 0 | 11 | 0 | 2 | 66358 |
| 2020-02-13 | 3 | 2 | 16 | 0 | 11 | 0 | 2 | 59895 |
| 2020-02-12 | 3 | 2 | 16 | 0 | 11 | 0 | 2 | 44759 |
| 2020-02-11 | 3 | 2 | 16 | 0 | 11 | 0 | 2 | 44386 |
| 2020-02-10 | 3 | 2 | 14 | 0 | 11 | 0 | 2 | 42354 |
| 2020-02-09 | 3 | 2 | 14 | 0 | 11 | 0 | 2 | 39829 |
| 2020-02-08 | 3 | 1 | 13 | 0 | 11 | 0 | 2 | 36814 |
| 2020-02-07 | 3 | 1 | 13 | 0 | 6 | 0 | 2 | 34110 |
| 2020-02-06 | 2 | 1 | 12 | 0 | 6 | 0 | 2 | 30587 |
| 2020-02-05 | 2 | 1 | 12 | 0 | 6 | 0 | 2 | 27440 |
| 2020-02-04 | 2 | 1 | 12 | 0 | 6 | 0 | 2 | 23707 |
| 2020-02-03 | 2 | 1 | 12 | 0 | 6 | 0 | 2 | 19716 |
| 2020-02-02 | 2 | 1 | 10 | 0 | 6 | 0 | 2 | 16630 |
| 2020-02-01 | 2 | 1 | 8 | 0 | 6 | 0 | 2 | 11891 |
| 2020-01-31 | 2 | 0 | 5 | 0 | 5 | 0 | 2 | 9802 |
| 2020-01-30 | 0 | 0 | 4 | 0 | 5 | 0 | 0 | 8141 |
| 2020-01-29 | 0 | 0 | 4 | 0 | 5 | 0 | 0 | 6087 |
| 2020-01-28 | 0 | 0 | 4 | 0 | 4 | 0 | 0 | 5509 |
| 2020-01-27 | 0 | 0 | 1 | 0 | 3 | 0 | 0 | 2877 |
| 2020-01-26 | 0 | 0 | 0 | 0 | 3 | 0 | 0 | 2075 |
| 2020-01-25 | 0 | 0 | 0 | 0 | 3 | 0 | 0 | 1406 |
| 2020-01-24 | 0 | 0 | 0 | 0 | 2 | 0 | 0 | 920 |
| 2020-01-23 | 0 | 0 | 0 | 0 | 0 | 0 | 0 | 643 |
| 2020-01-22 | 0 | 0 | 0 | 0 | 0 | 0 | 0 | 548 |